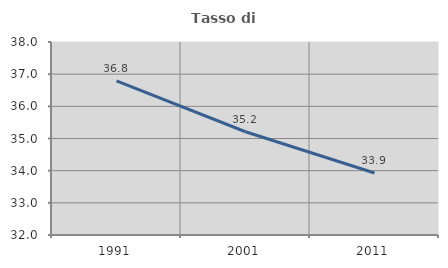
| Category | Tasso di occupazione   |
|---|---|
| 1991.0 | 36.794 |
| 2001.0 | 35.209 |
| 2011.0 | 33.926 |